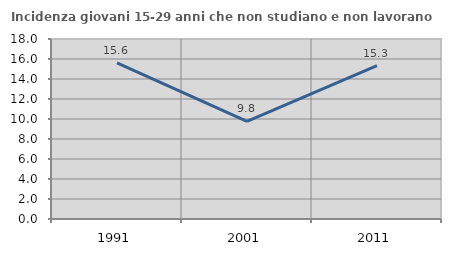
| Category | Incidenza giovani 15-29 anni che non studiano e non lavorano  |
|---|---|
| 1991.0 | 15.615 |
| 2001.0 | 9.759 |
| 2011.0 | 15.345 |